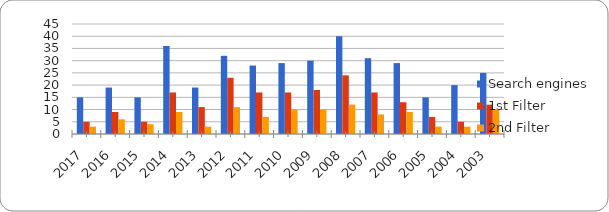
| Category | Search engines | 1st Filter | 2nd Filter |
|---|---|---|---|
| 2017.0 | 15 | 5 | 3 |
| 2016.0 | 19 | 9 | 6 |
| 2015.0 | 15 | 5 | 4 |
| 2014.0 | 36 | 17 | 9 |
| 2013.0 | 19 | 11 | 3 |
| 2012.0 | 32 | 23 | 11 |
| 2011.0 | 28 | 17 | 7 |
| 2010.0 | 29 | 17 | 10 |
| 2009.0 | 30 | 18 | 10 |
| 2008.0 | 40 | 24 | 12 |
| 2007.0 | 31 | 17 | 8 |
| 2006.0 | 29 | 13 | 9 |
| 2005.0 | 15 | 7 | 3 |
| 2004.0 | 20 | 5 | 3 |
| 2003.0 | 25 | 12 | 10 |